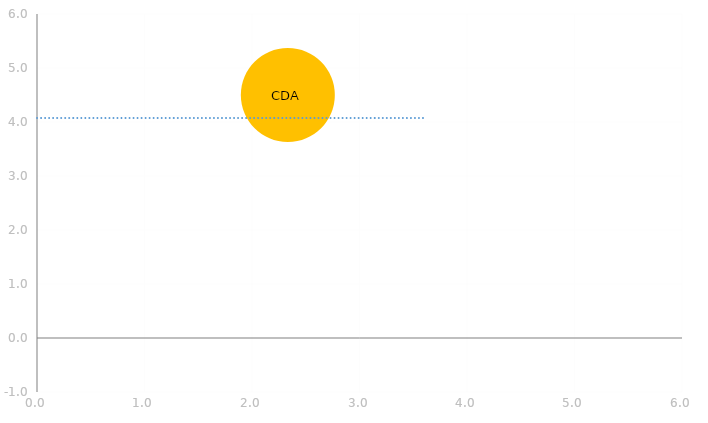
| Category | Series 2 |
|---|---|
| 2.3333333333333335 | 4.5 |
| 0.0 | 0 |
| 0.0 | 0 |
| 0.0 | 0 |
| 0.0 | 0 |
| 0.0 | 0 |
| 0.0 | 0 |
| 0.0 | 0 |
| 0.0 | 0 |
| 0.0 | 0 |